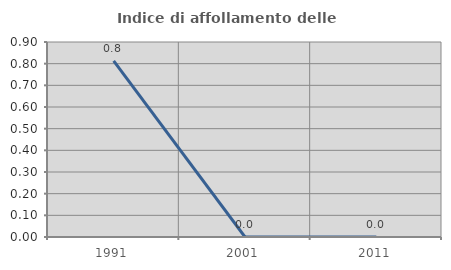
| Category | Indice di affollamento delle abitazioni  |
|---|---|
| 1991.0 | 0.813 |
| 2001.0 | 0 |
| 2011.0 | 0 |